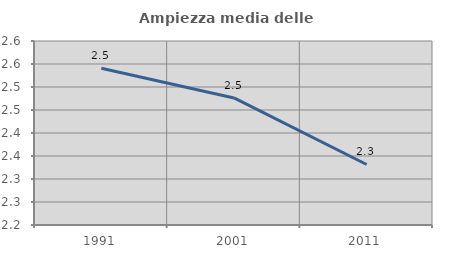
| Category | Ampiezza media delle famiglie |
|---|---|
| 1991.0 | 2.541 |
| 2001.0 | 2.476 |
| 2011.0 | 2.332 |